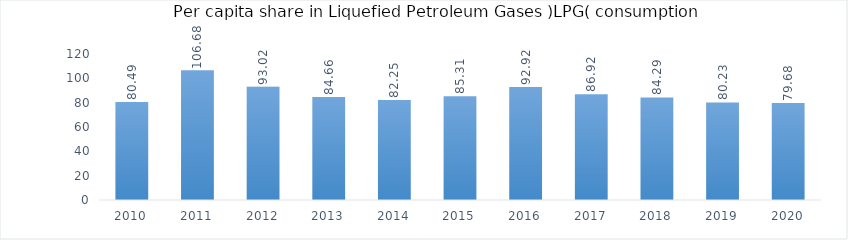
| Category | Per capita share in Liquefied Petroleum Gases (LPG) consumption  |
|---|---|
| 2010.0 | 80.49 |
| 2011.0 | 106.68 |
| 2012.0 | 93.02 |
| 2013.0 | 84.66 |
| 2014.0 | 82.25 |
| 2015.0 | 85.31 |
| 2016.0 | 92.92 |
| 2017.0 | 86.92 |
| 2018.0 | 84.29 |
| 2019.0 | 80.23 |
| 2020.0 | 79.68 |